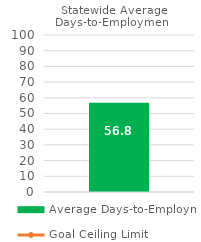
| Category | Average Days-to-Employment |
|---|---|
| 0 | 56.784 |